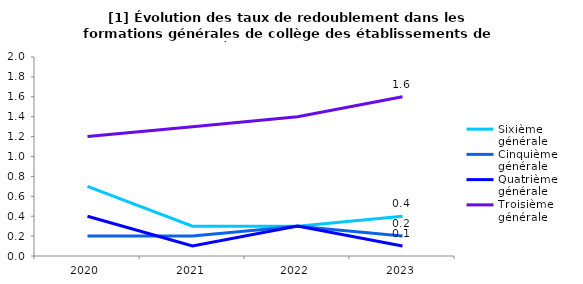
| Category | Sixième générale | Cinquième générale | Quatrième générale | Troisième générale |
|---|---|---|---|---|
| 2020.0 | 0.7 | 0.2 | 0.4 | 1.2 |
| 2021.0 | 0.3 | 0.2 | 0.1 | 1.3 |
| 2022.0 | 0.3 | 0.3 | 0.3 | 1.4 |
| 2023.0 | 0.4 | 0.2 | 0.1 | 1.6 |